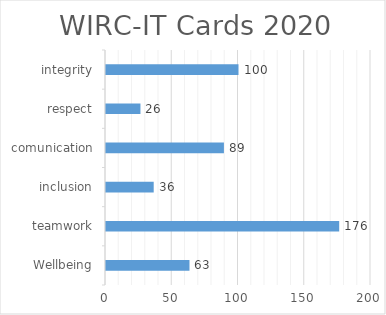
| Category | # |
|---|---|
| Wellbeing | 63 |
| teamwork | 176 |
| inclusion | 36 |
| comunication | 89 |
| respect | 26 |
| integrity | 100 |